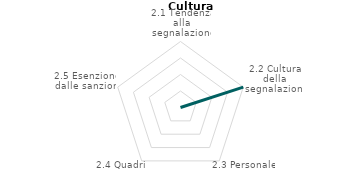
| Category | Series 2 |
|---|---|
| 2.1 Tendenza alla segnalazione | 0 |
| 2.2 Cultura della segnalazione | 1 |
| 2.3 Personale | 0 |
| 2.4 Quadri | 0 |
| 2.5 Esenzione dalle sanzioni | 0 |